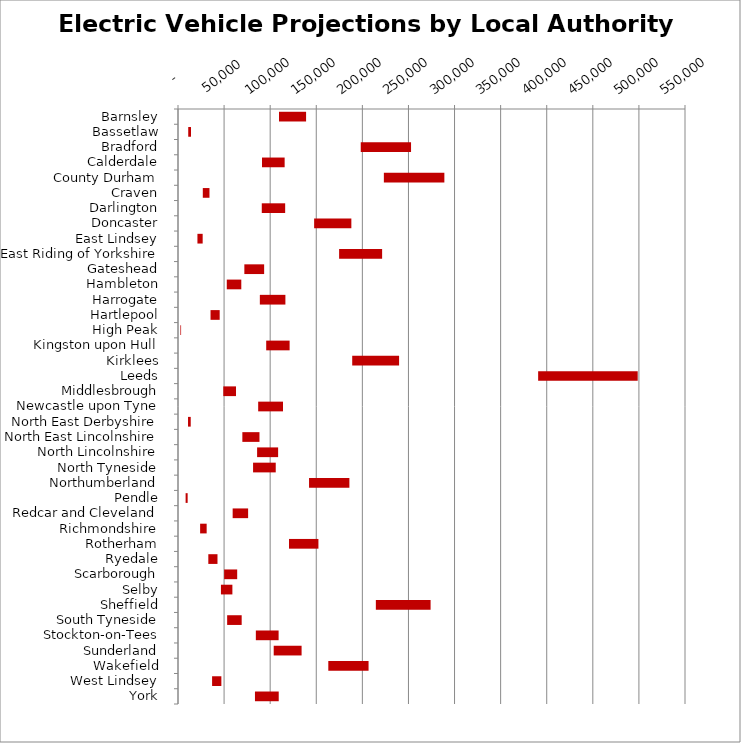
| Category | MIN | MAX |
|---|---|---|
| Barnsley | 109567 | 29379 |
| Bassetlaw | 11102 | 2991 |
| Bradford | 198244 | 54565 |
| Calderdale | 91118 | 24568 |
| County Durham | 223319 | 65632 |
| Craven | 26903 | 7233 |
| Darlington | 90874 | 25383 |
| Doncaster | 147681 | 40375 |
| East Lindsey | 21083 | 5679 |
| East Riding of Yorkshire | 174775 | 46661 |
| Gateshead | 71976 | 21473 |
| Hambleton | 52905 | 15760 |
| Harrogate | 88783 | 27723 |
| Hartlepool | 35287 | 9929 |
| High Peak | 2608 | 736 |
| Kingston upon Hull | 95686 | 25392 |
| Kirklees | 188991 | 50854 |
| Leeds | 390690 | 108010 |
| Middlesbrough | 49130 | 13787 |
| Newcastle upon Tyne | 86973 | 26953 |
| North East Derbyshire | 10881 | 2923 |
| North East Lincolnshire | 69808 | 18578 |
| North Lincolnshire | 85811 | 22805 |
| North Tyneside | 81435 | 24590 |
| Northumberland | 142160 | 43766 |
| Pendle | 8255 | 2208 |
| Redcar and Cleveland | 59291 | 16776 |
| Richmondshire | 24001 | 7087 |
| Rotherham | 120383 | 31950 |
| Ryedale | 32887 | 9946 |
| Scarborough | 50047 | 14157 |
| Selby | 46578 | 12420 |
| Sheffield | 214630 | 59384 |
| South Tyneside | 53318 | 15753 |
| Stockton-on-Tees | 84441 | 24703 |
| Sunderland | 103822 | 30250 |
| Wakefield | 163051 | 43670 |
| West Lindsey | 36980 | 10059 |
| York | 83480 | 25782 |